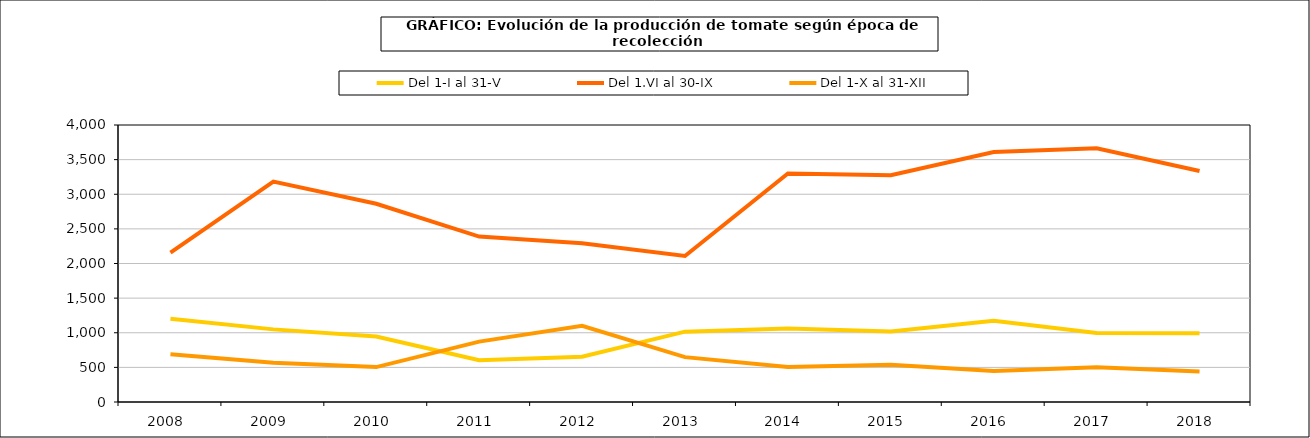
| Category | Del 1-I al 31-V | Del 1.VI al 30-IX | Del 1-X al 31-XII |
|---|---|---|---|
| 2008.0 | 1201.903 | 2157.063 | 690.787 |
| 2009.0 | 1048.651 | 3182.545 | 566.857 |
| 2010.0 | 946.174 | 2862.288 | 504.247 |
| 2011.0 | 603.266 | 2389.177 | 871.679 |
| 2012.0 | 652.744 | 2292.602 | 1101.067 |
| 2013.0 | 1015.956 | 2108.99 | 647.9 |
| 2014.0 | 1061.306 | 3300.096 | 504.058 |
| 2015.0 | 1017.886 | 3275.48 | 539.334 |
| 2016.0 | 1174.446 | 3611.158 | 447.938 |
| 2017.0 | 995.505 | 3664.966 | 502.995 |
| 2018.0 | 991.845 | 3336.107 | 440.643 |